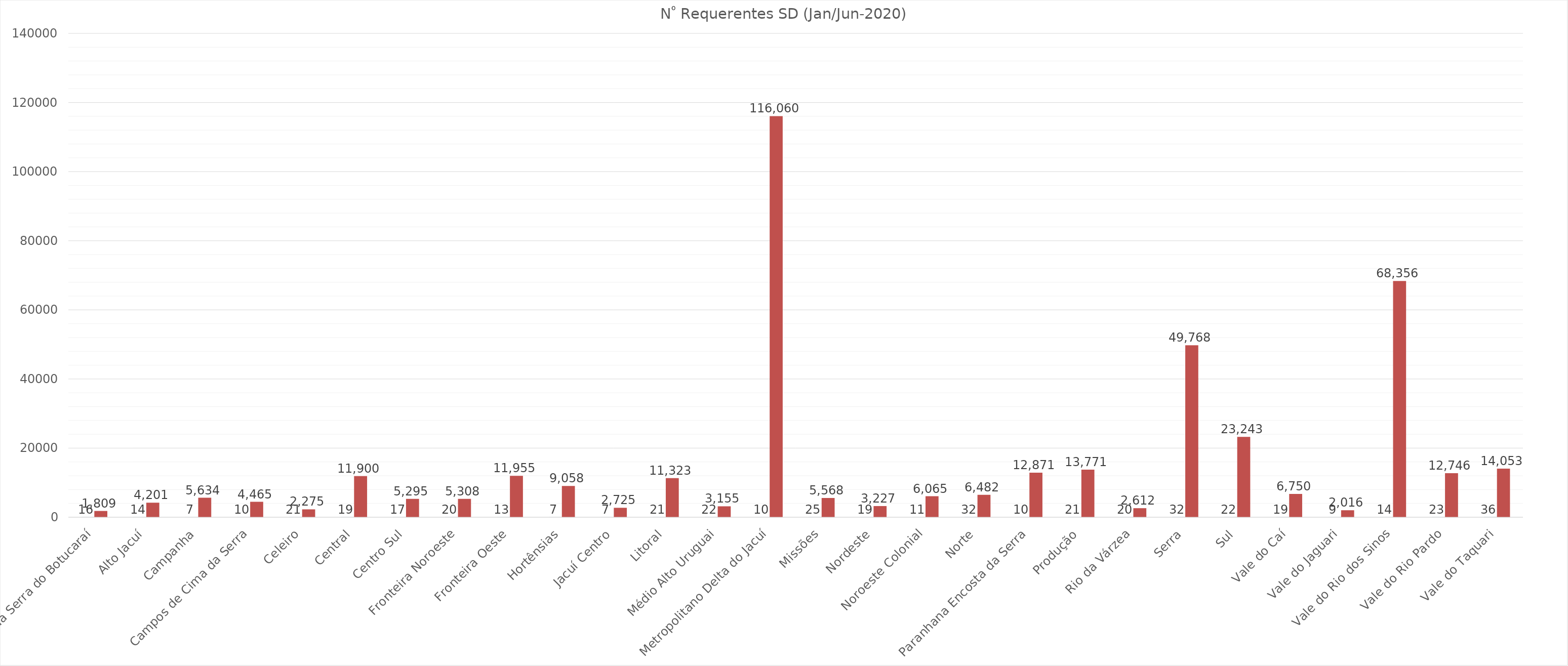
| Category | Quantidade de Municípios | No Requerentes SD (2020) |
|---|---|---|
| Alto da Serra do Botucaraí | 16 | 1809 |
| Alto Jacuí | 14 | 4201 |
| Campanha | 7 | 5634 |
| Campos de Cima da Serra | 10 | 4465 |
| Celeiro | 21 | 2275 |
| Central | 19 | 11900 |
| Centro Sul | 17 | 5295 |
| Fronteira Noroeste | 20 | 5308 |
| Fronteira Oeste | 13 | 11955 |
| Hortênsias | 7 | 9058 |
| Jacuí Centro | 7 | 2725 |
| Litoral | 21 | 11323 |
| Médio Alto Uruguai | 22 | 3155 |
| Metropolitano Delta do Jacuí | 10 | 116060 |
| Missões | 25 | 5568 |
| Nordeste | 19 | 3227 |
| Noroeste Colonial | 11 | 6065 |
| Norte | 32 | 6482 |
| Paranhana Encosta da Serra | 10 | 12871 |
| Produção | 21 | 13771 |
| Rio da Várzea | 20 | 2612 |
| Serra | 32 | 49768 |
| Sul | 22 | 23243 |
| Vale do Caí | 19 | 6750 |
| Vale do Jaguari | 9 | 2016 |
| Vale do Rio dos Sinos | 14 | 68356 |
| Vale do Rio Pardo | 23 | 12746 |
| Vale do Taquari | 36 | 14053 |